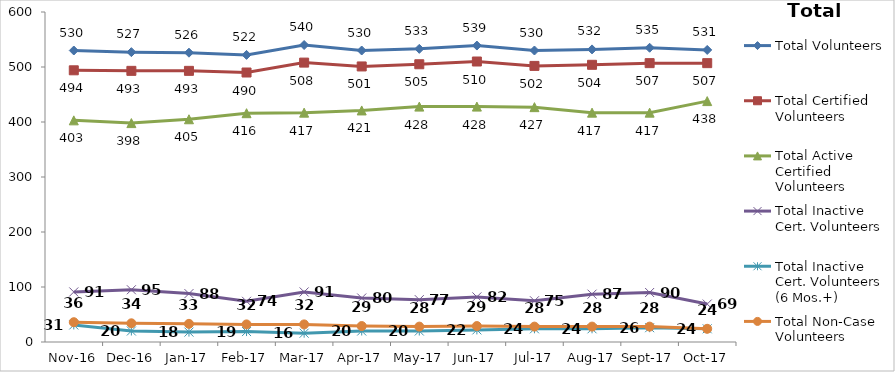
| Category | Total Volunteers | Total Certified Volunteers | Total Active Certified Volunteers | Total Inactive Cert. Volunteers | Total Inactive Cert. Volunteers (6 Mos.+) | Total Non-Case Volunteers |
|---|---|---|---|---|---|---|
| 2016-11-01 | 530 | 494 | 403 | 91 | 31 | 36 |
| 2016-12-01 | 527 | 493 | 398 | 95 | 20 | 34 |
| 2017-01-01 | 526 | 493 | 405 | 88 | 18 | 33 |
| 2017-02-01 | 522 | 490 | 416 | 74 | 19 | 32 |
| 2017-03-01 | 540 | 508 | 417 | 91 | 16 | 32 |
| 2017-04-01 | 530 | 501 | 421 | 80 | 20 | 29 |
| 2017-05-01 | 533 | 505 | 428 | 77 | 20 | 28 |
| 2017-06-01 | 539 | 510 | 428 | 82 | 22 | 29 |
| 2017-07-01 | 530 | 502 | 427 | 75 | 24 | 28 |
| 2017-08-01 | 532 | 504 | 417 | 87 | 24 | 28 |
| 2017-09-01 | 535 | 507 | 417 | 90 | 26 | 28 |
| 2017-10-01 | 531 | 507 | 438 | 69 | 24 | 24 |